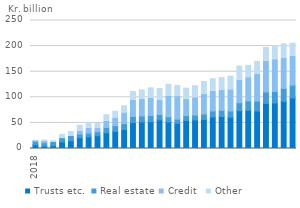
| Category | Trusts etc.  | Real estate | Credit  | Other |
|---|---|---|---|---|
| 2018-01-01 | 7.29 | 6.571 | 1.249 | 0.58 |
| 2018-02-01 | 4.748 | 6.609 | 2.858 | 2.494 |
| 2018-03-01 | 5.515 | 6.219 | -2.359 | 3.51 |
| 2018-04-01 | 13.034 | 6.377 | -3.071 | 8.186 |
| 2018-05-01 | 15.187 | 8.743 | -0.374 | 9.143 |
| 2018-06-01 | 21.119 | 7.031 | 5.942 | 11.359 |
| 2018-07-01 | 22.856 | 7.045 | 9.452 | 11.438 |
| 2018-08-01 | 24.925 | 7.734 | 6.316 | 10.245 |
| 2018-09-01 | 30.617 | 10.367 | 12.708 | 12.162 |
| 2018-10-01 | 33.384 | 11.082 | 15.257 | 12.974 |
| 2018-11-01 | 36.992 | 11.647 | 21.026 | 13.686 |
| 2018-12-01 | 50.602 | 12.06 | 31.193 | 17.318 |
| 2019-01-01 | 51.977 | 11.663 | 32.86 | 17.831 |
| 2019-02-01 | 52.098 | 12.263 | 33.654 | 20.45 |
| 2019-03-01 | 55.857 | 10.591 | 27.951 | 22.665 |
| 2019-04-01 | 51.742 | 10.08 | 40.517 | 23.146 |
| 2019-05-01 | 49.03 | 8.272 | 44.019 | 21.786 |
| 2019-06-01 | 54.627 | 9.575 | 32.35 | 21.383 |
| 2019-07-01 | 55.725 | 9.614 | 33.72 | 23.489 |
| 2019-08-01 | 56.766 | 10.552 | 38.465 | 25.282 |
| 2019-09-01 | 61.477 | 11.791 | 38.515 | 24.515 |
| 2019-10-01 | 62.532 | 12.121 | 39.325 | 24.53 |
| 2019-11-01 | 61.014 | 12.142 | 41.597 | 26.48 |
| 2019-12-01 | 73.719 | 15.646 | 44.438 | 27.201 |
| 2020-01-01 | 74.505 | 18.429 | 45.43 | 24.009 |
| 2020-02-01 | 73.251 | 19.419 | 52.668 | 24.852 |
| 2020-03-01 | 88.112 | 22.237 | 60.164 | 26.833 |
| 2020-04-01 | 88.841 | 22.489 | 62.11 | 27.836 |
| 2020-05-01 | 92.039 | 25.371 | 58.37 | 28.648 |
| 2020-06-01 | 98.649 | 24.976 | 57.074 | 25.007 |